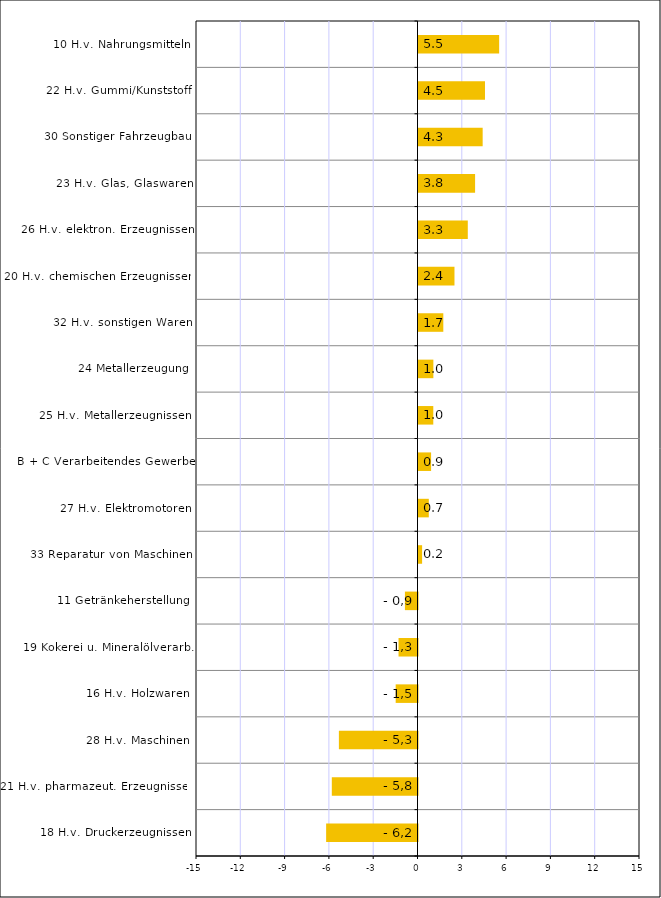
| Category | Series 0 |
|---|---|
| 18 H.v. Druckerzeugnissen | -6.187 |
| 21 H.v. pharmazeut. Erzeugnissen | -5.803 |
| 28 H.v. Maschinen | -5.324 |
| 16 H.v. Holzwaren | -1.478 |
| 19 Kokerei u. Mineralölverarb. | -1.284 |
| 11 Getränkeherstellung | -0.852 |
| 33 Reparatur von Maschinen | 0.244 |
| 27 H.v. Elektromotoren | 0.697 |
| B + C Verarbeitendes Gewerbe | 0.852 |
| 25 H.v. Metallerzeugnissen | 1.001 |
| 24 Metallerzeugung | 1.006 |
| 32 H.v. sonstigen Waren | 1.68 |
| 20 H.v. chemischen Erzeugnissen | 2.436 |
| 26 H.v. elektron. Erzeugnissen | 3.338 |
| 23 H.v. Glas, Glaswaren | 3.832 |
| 30 Sonstiger Fahrzeugbau | 4.345 |
| 22 H.v. Gummi/Kunststoff | 4.503 |
| 10 H.v. Nahrungsmitteln | 5.462 |